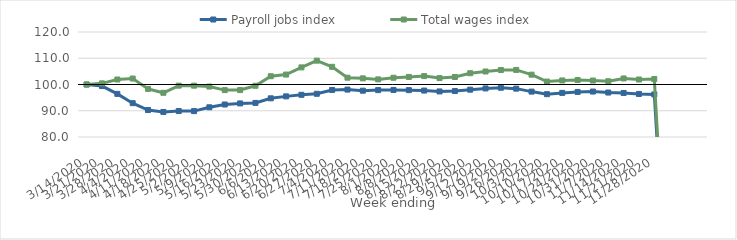
| Category | Payroll jobs index | Total wages index |
|---|---|---|
| 14/03/2020 | 100 | 100 |
| 21/03/2020 | 99.412 | 100.438 |
| 28/03/2020 | 96.424 | 101.91 |
| 04/04/2020 | 92.889 | 102.272 |
| 11/04/2020 | 90.267 | 98.327 |
| 18/04/2020 | 89.544 | 96.838 |
| 25/04/2020 | 89.882 | 99.565 |
| 02/05/2020 | 89.863 | 99.559 |
| 09/05/2020 | 91.319 | 99.22 |
| 16/05/2020 | 92.382 | 97.864 |
| 23/05/2020 | 92.787 | 97.878 |
| 30/05/2020 | 92.986 | 99.509 |
| 06/06/2020 | 94.735 | 103.152 |
| 13/06/2020 | 95.476 | 103.788 |
| 20/06/2020 | 96.077 | 106.518 |
| 27/06/2020 | 96.459 | 109.087 |
| 04/07/2020 | 97.924 | 106.737 |
| 11/07/2020 | 98.06 | 102.595 |
| 18/07/2020 | 97.642 | 102.344 |
| 25/07/2020 | 97.861 | 101.95 |
| 01/08/2020 | 97.925 | 102.573 |
| 08/08/2020 | 97.853 | 102.882 |
| 15/08/2020 | 97.685 | 103.205 |
| 22/08/2020 | 97.357 | 102.437 |
| 29/08/2020 | 97.502 | 102.848 |
| 05/09/2020 | 98.028 | 104.3 |
| 12/09/2020 | 98.502 | 104.963 |
| 19/09/2020 | 98.77 | 105.516 |
| 26/09/2020 | 98.42 | 105.554 |
| 03/10/2020 | 97.295 | 103.742 |
| 10/10/2020 | 96.318 | 101.123 |
| 17/10/2020 | 96.8 | 101.543 |
| 24/10/2020 | 97.167 | 101.703 |
| 31/10/2020 | 97.315 | 101.516 |
| 07/11/2020 | 96.935 | 101.235 |
| 14/11/2020 | 96.778 | 102.307 |
| 21/11/2020 | 96.401 | 101.896 |
| 28/11/2020 | 96.225 | 102.08 |